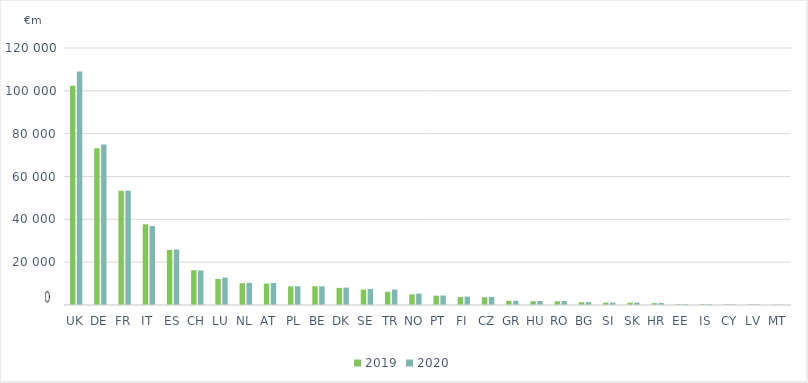
| Category | 2019 | 2020 |
|---|---|---|
| UK | 102360.346 | 108988.423 |
| DE | 73205 | 74902 |
| FR | 53324.775 | 53366.618 |
| IT | 37672 | 36850 |
| ES | 25746 | 25904 |
| CH | 16237.295 | 16138.077 |
| LU | 12134.994 | 12766.484 |
| NL | 10174 | 10332 |
| AT | 9983 | 10242 |
| PL | 8697.952 | 8767.274 |
| BE | 8737.544 | 8713.503 |
| DK | 7965.174 | 8141.316 |
| SE | 7173.527 | 7500.763 |
| TR | 6150.074 | 7207.717 |
| NO | 4959.432 | 5325.941 |
| PT | 4331.872 | 4414.467 |
| FI | 3698 | 3925 |
| CZ | 3608.996 | 3769.201 |
| GR | 1971 | 1954 |
| HU | 1773.31 | 1871.032 |
| RO | 1747.101 | 1850.857 |
| BG | 1307.598 | 1319.153 |
| SI | 1109.58 | 1127.26 |
| SK | 1083 | 1108 |
| HR | 861.987 | 906.558 |
| EE | 395.98 | 381.269 |
| IS | 369.06 | 369.06 |
| CY | 338 | 350 |
| LV | 334.2 | 313.2 |
| MT | 178.08 | 171.97 |